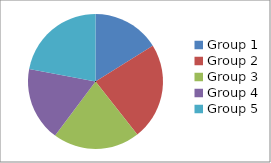
| Category | Series 0 |
|---|---|
| Group 1 | 120 |
| Group 2 | 173 |
| Group 3 | 155 |
| Group 4 | 132 |
| Group 5 | 164 |